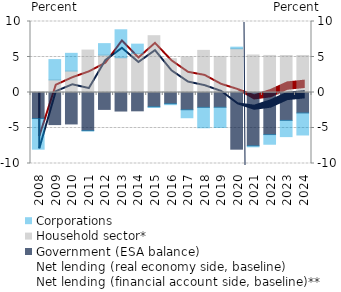
| Category | Government (ESA balance) | Household sector* | Corporations |
|---|---|---|---|
| 2008.0 | -3.672 | 0.052 | -4.314 |
| 2009.0 | -4.521 | 1.775 | 2.86 |
| 2010.0 | -4.43 | 3.024 | 2.493 |
| 2011.0 | -5.368 | 5.979 | -0.054 |
| 2012.0 | -2.381 | 5.276 | 1.609 |
| 2013.0 | -2.611 | 4.897 | 3.936 |
| 2014.0 | -2.581 | 5.501 | 1.31 |
| 2015.0 | -2.003 | 8.002 | -0.1 |
| 2016.0 | -1.573 | 4.768 | -0.143 |
| 2017.0 | -2.428 | 5.026 | -1.128 |
| 2018.0 | -2.094 | 5.936 | -2.873 |
| 2019.0 | -2.078 | 5.088 | -2.853 |
| 2020.0 | -7.983 | 6.168 | 0.219 |
| 2021.0 | -7.501 | 5.285 | -0.151 |
| 2022.0 | -5.926 | 5.222 | -1.361 |
| 2023.0 | -3.927 | 5.21 | -2.288 |
| 2024.0 | -2.881 | 5.216 | -3.104 |